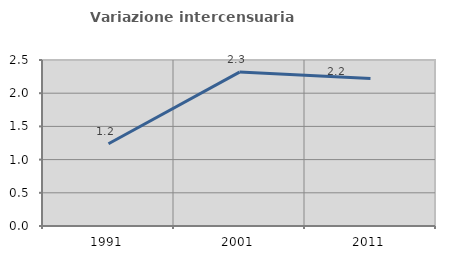
| Category | Variazione intercensuaria annua |
|---|---|
| 1991.0 | 1.239 |
| 2001.0 | 2.318 |
| 2011.0 | 2.222 |